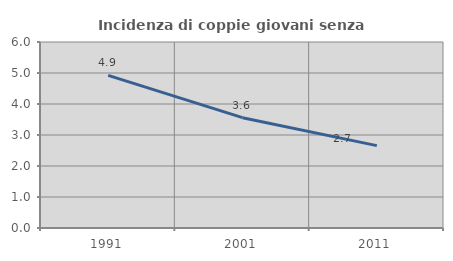
| Category | Incidenza di coppie giovani senza figli |
|---|---|
| 1991.0 | 4.921 |
| 2001.0 | 3.559 |
| 2011.0 | 2.656 |